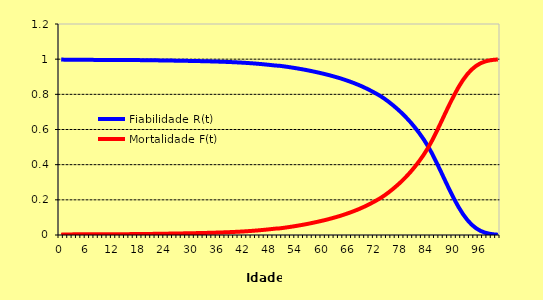
| Category | Fiabilidade R(t) | Mortalidade F(t) |
|---|---|---|
| 0.0 | 0.998 | 0.002 |
| 1.0 | 0.997 | 0.003 |
| 2.0 | 0.997 | 0.003 |
| 3.0 | 0.996 | 0.004 |
| 4.0 | 0.996 | 0.004 |
| 5.0 | 0.996 | 0.004 |
| 6.0 | 0.996 | 0.004 |
| 7.0 | 0.996 | 0.004 |
| 8.0 | 0.996 | 0.004 |
| 9.0 | 0.996 | 0.004 |
| 10.0 | 0.996 | 0.004 |
| 11.0 | 0.996 | 0.004 |
| 12.0 | 0.996 | 0.004 |
| 13.0 | 0.995 | 0.005 |
| 14.0 | 0.995 | 0.005 |
| 15.0 | 0.995 | 0.005 |
| 16.0 | 0.995 | 0.005 |
| 17.0 | 0.995 | 0.005 |
| 18.0 | 0.995 | 0.005 |
| 19.0 | 0.994 | 0.006 |
| 20.0 | 0.994 | 0.006 |
| 21.0 | 0.994 | 0.006 |
| 22.0 | 0.993 | 0.007 |
| 23.0 | 0.993 | 0.007 |
| 24.0 | 0.992 | 0.008 |
| 25.0 | 0.992 | 0.008 |
| 26.0 | 0.992 | 0.008 |
| 27.0 | 0.991 | 0.009 |
| 28.0 | 0.991 | 0.009 |
| 29.0 | 0.99 | 0.01 |
| 30.0 | 0.99 | 0.01 |
| 31.0 | 0.989 | 0.011 |
| 32.0 | 0.989 | 0.011 |
| 33.0 | 0.988 | 0.012 |
| 34.0 | 0.988 | 0.012 |
| 35.0 | 0.987 | 0.013 |
| 36.0 | 0.986 | 0.014 |
| 37.0 | 0.985 | 0.015 |
| 38.0 | 0.984 | 0.016 |
| 39.0 | 0.983 | 0.017 |
| 40.0 | 0.982 | 0.018 |
| 41.0 | 0.981 | 0.019 |
| 42.0 | 0.979 | 0.021 |
| 43.0 | 0.978 | 0.022 |
| 44.0 | 0.976 | 0.024 |
| 45.0 | 0.974 | 0.026 |
| 46.0 | 0.972 | 0.028 |
| 47.0 | 0.969 | 0.031 |
| 48.0 | 0.967 | 0.033 |
| 49.0 | 0.964 | 0.036 |
| 50.0 | 0.962 | 0.038 |
| 51.0 | 0.959 | 0.041 |
| 52.0 | 0.956 | 0.044 |
| 53.0 | 0.952 | 0.048 |
| 54.0 | 0.948 | 0.052 |
| 55.0 | 0.943 | 0.057 |
| 56.0 | 0.939 | 0.061 |
| 57.0 | 0.934 | 0.066 |
| 58.0 | 0.929 | 0.071 |
| 59.0 | 0.923 | 0.077 |
| 60.0 | 0.918 | 0.083 |
| 61.0 | 0.911 | 0.089 |
| 62.0 | 0.905 | 0.095 |
| 63.0 | 0.898 | 0.102 |
| 64.0 | 0.891 | 0.109 |
| 65.0 | 0.882 | 0.118 |
| 66.0 | 0.874 | 0.126 |
| 67.0 | 0.865 | 0.135 |
| 68.0 | 0.855 | 0.145 |
| 69.0 | 0.844 | 0.156 |
| 70.0 | 0.832 | 0.168 |
| 71.0 | 0.82 | 0.18 |
| 72.0 | 0.806 | 0.194 |
| 73.0 | 0.792 | 0.208 |
| 74.0 | 0.776 | 0.224 |
| 75.0 | 0.758 | 0.242 |
| 76.0 | 0.738 | 0.262 |
| 77.0 | 0.717 | 0.283 |
| 78.0 | 0.694 | 0.306 |
| 79.0 | 0.669 | 0.331 |
| 80.0 | 0.642 | 0.358 |
| 81.0 | 0.612 | 0.388 |
| 82.0 | 0.58 | 0.42 |
| 83.0 | 0.545 | 0.455 |
| 84.0 | 0.505 | 0.495 |
| 85.0 | 0.46 | 0.54 |
| 86.0 | 0.411 | 0.589 |
| 87.0 | 0.359 | 0.641 |
| 88.0 | 0.306 | 0.694 |
| 89.0 | 0.254 | 0.746 |
| 90.0 | 0.205 | 0.795 |
| 91.0 | 0.159 | 0.841 |
| 92.0 | 0.119 | 0.881 |
| 93.0 | 0.086 | 0.914 |
| 94.0 | 0.059 | 0.941 |
| 95.0 | 0.039 | 0.961 |
| 96.0 | 0.024 | 0.976 |
| 97.0 | 0.014 | 0.986 |
| 98.0 | 0.008 | 0.992 |
| 99.0 | 0.004 | 0.996 |
| 100.0 | 0.002 | 0.998 |